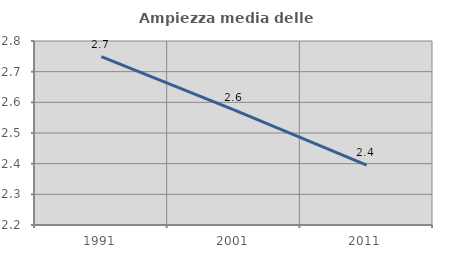
| Category | Ampiezza media delle famiglie |
|---|---|
| 1991.0 | 2.749 |
| 2001.0 | 2.575 |
| 2011.0 | 2.395 |